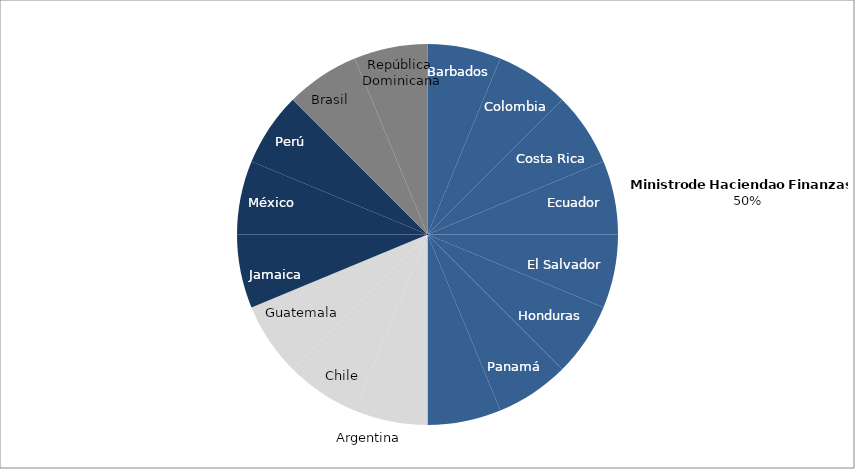
| Category | Series 0 |
|---|---|
| Barbados | 1 |
| Colombia | 1 |
| Costa Rica | 1 |
| Ecuador | 1 |
| El Salvador | 1 |
| Honduras | 1 |
| Panama | 1 |
| Paraguay | 1 |
| Argentina | 1 |
| Chile | 1 |
| Guatemala | 1 |
| Jamaica | 1 |
| Mexico | 1 |
| Peru | 1 |
| Brazil | 1 |
| Dominican Republic | 1 |